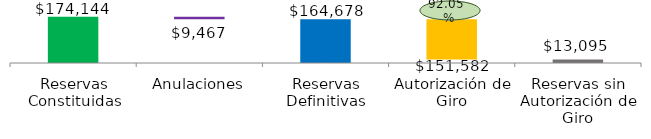
| Category | Flotante | Serie Graf |
|---|---|---|
| Reservas Constituidas | 0 | 174144.465 |
| Anulaciones | 164677.612 | 9466.854 |
| Reservas Definitivas | 0 | 164677.612 |
| Autorización de Giro | 13095.488 | 151582.123 |
| Reservas sin Autorización de Giro | 0 | 13095.488 |